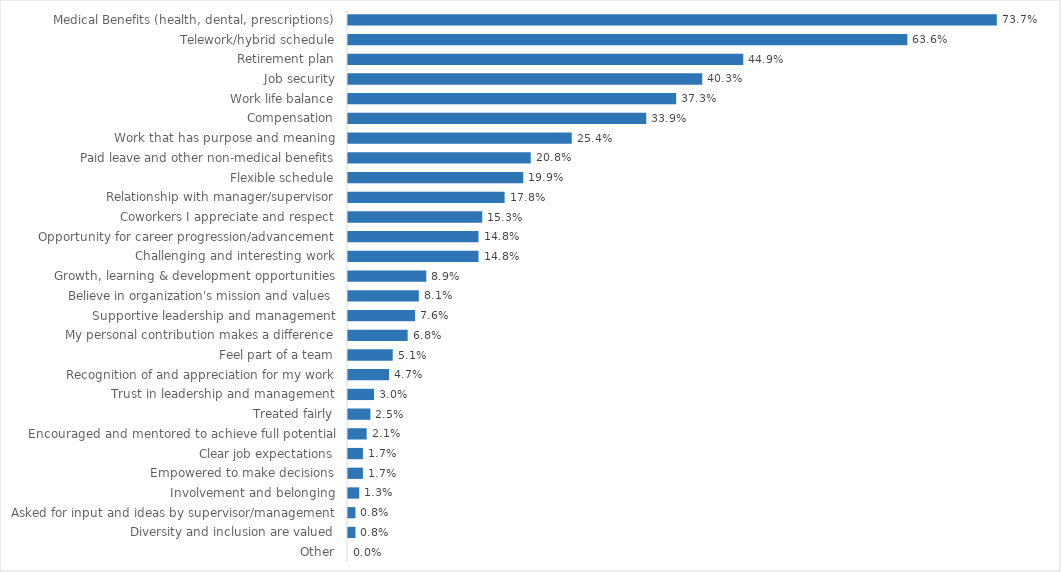
| Category | Vermont Health Access |
|---|---|
| Medical Benefits (health, dental, prescriptions) | 0.737 |
| Telework/hybrid schedule | 0.636 |
| Retirement plan | 0.449 |
| Job security | 0.403 |
| Work life balance | 0.373 |
| Compensation | 0.339 |
| Work that has purpose and meaning | 0.254 |
| Paid leave and other non-medical benefits | 0.208 |
| Flexible schedule | 0.199 |
| Relationship with manager/supervisor | 0.178 |
| Coworkers I appreciate and respect | 0.153 |
| Opportunity for career progression/advancement | 0.148 |
| Challenging and interesting work | 0.148 |
| Growth, learning & development opportunities | 0.089 |
| Believe in organization's mission and values | 0.081 |
| Supportive leadership and management | 0.076 |
| My personal contribution makes a difference | 0.068 |
| Feel part of a team | 0.051 |
| Recognition of and appreciation for my work | 0.047 |
| Trust in leadership and management | 0.03 |
| Treated fairly | 0.025 |
| Encouraged and mentored to achieve full potential | 0.021 |
| Clear job expectations | 0.017 |
| Empowered to make decisions | 0.017 |
| Involvement and belonging | 0.013 |
| Asked for input and ideas by supervisor/management | 0.008 |
| Diversity and inclusion are valued | 0.008 |
| Other | 0 |